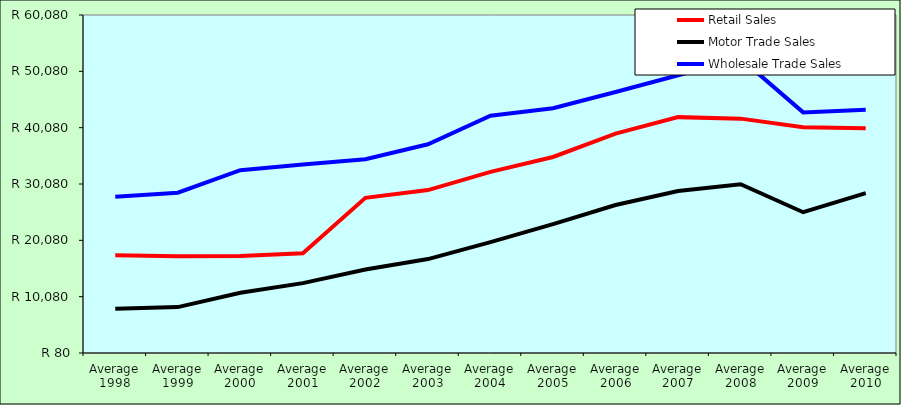
| Category | Retail Sales  | Motor Trade Sales | Wholesale Trade Sales |
|---|---|---|---|
| Average 1998 | 17425.5 | 7921 | 27807.333 |
| Average 1999 | 17237.583 | 8232 | 28532.333 |
| Average 2000 | 17300.667 | 10762.917 | 32527.5 |
| Average 2001 | 17772.833 | 12482.167 | 33522.417 |
| Average 2002 | 27629.667 | 14908.167 | 34464.917 |
| Average 2003 | 28996.167 | 16750.333 | 37136.333 |
| Average 2004 | 32240.417 | 19767.75 | 42187.083 |
| Average 2005 | 34879.667 | 22950.75 | 43532.5 |
| Average 2006 | 39037.167 | 26349.667 | 46409.25 |
| Average 2007 | 41950.455 | 28832.273 | 49383.455 |
| Average 2008 | 41682.583 | 30045.167 | 52379.25 |
| Average 2009 | 40159 | 25071.333 | 42793.417 |
| Average 2010 | 39960.875 | 28459.25 | 43257 |